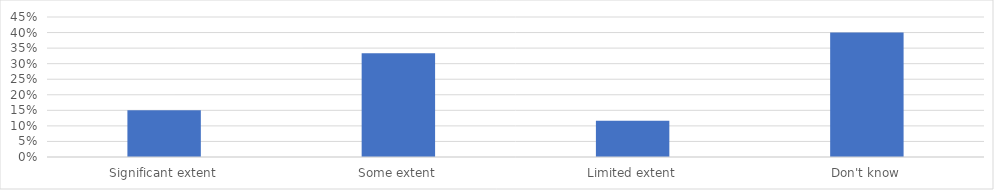
| Category | % of Respondents |
|---|---|
| Significant extent | 0.15 |
| Some extent | 0.333 |
| Limited extent | 0.117 |
| Don't know | 0.4 |